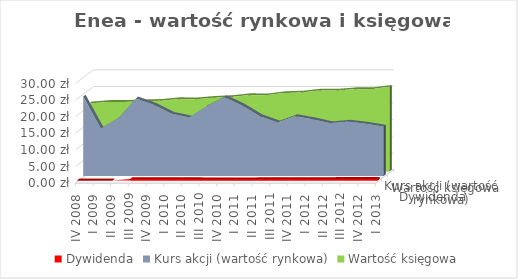
| Category | Dywidenda | Kurs akcji (wartość rynkowa) | Wartość księgowa |
|---|---|---|---|
| IV 2008 | 0 | 23.882 | 20.443 |
| I 2009 | 0 | 14.25 | 20.891 |
| II 2009 | 0 | 17.38 | 20.911 |
| III 2009 | 0.46 | 23.3 | 21.085 |
| IV 2009 | 0.46 | 21.4 | 21.232 |
| I 2010 | 0.46 | 18.73 | 21.733 |
| II 2010 | 0.46 | 17.6 | 21.683 |
| III 2010 | 0.38 | 20.95 | 22.14 |
| IV 2010 | 0.38 | 23.7 | 22.373 |
| I 2011 | 0.38 | 21.2 | 22.947 |
| II 2011 | 0.38 | 18 | 22.877 |
| III 2011 | 0.44 | 16.1 | 23.571 |
| IV 2011 | 0.44 | 18 | 23.74 |
| I 2012 | 0.44 | 17.05 | 24.325 |
| II 2012 | 0.44 | 15.87 | 24.308 |
| III 2012 | 0.48 | 16.35 | 24.734 |
| IV 2012 | 0.48 | 15.73 | 24.779 |
| I 2013 | 0.48 | 14.85 | 25.463 |